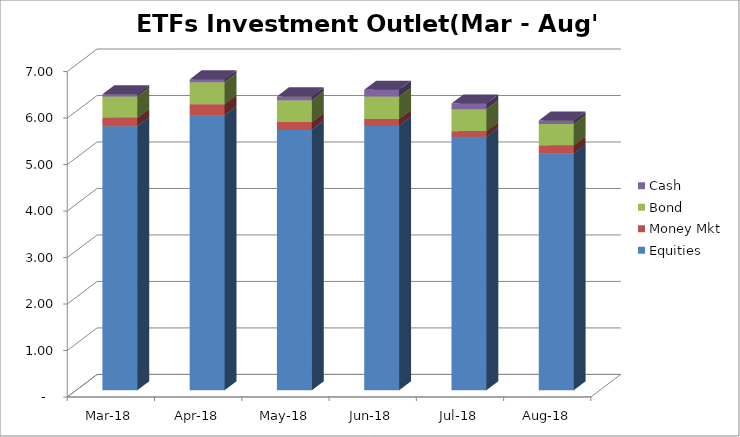
| Category | Equities | Money Mkt | Bond | Cash |
|---|---|---|---|---|
| 2018-03-01 | 5680580702.11 | 178223610.44 | 461242108.34 | 47114040.72 |
| 2018-04-01 | 5916812401.32 | 236436196.19 | 473183326.33 | 59989270.56 |
| 2018-05-01 | 5604937403.21 | 163325823.53 | 470433442.99 | 82279978.28 |
| 2018-06-01 | 5688266618.66 | 146073161.64 | 483544793.6 | 144539302.66 |
| 2018-07-01 | 5450573222.74 | 120602888.23 | 474827704.85 | 119719492.83 |
| 2018-08-01 | 5095492053.52 | 171301483.56 | 457917264.22 | 74763035.01 |